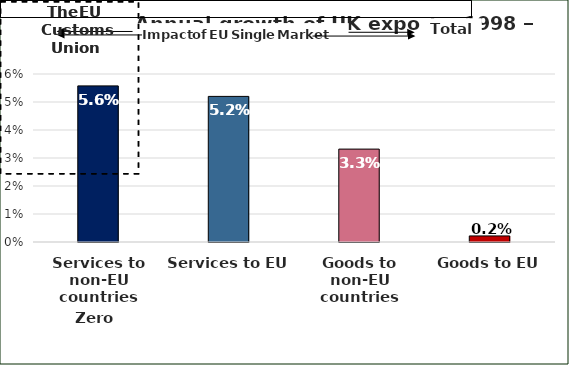
| Category | CAGR 1998/99 - 2017 |
|---|---|
| Services to non-EU countries | 0.056 |
| Services to EU  | 0.052 |
| Goods to non-EU countries | 0.033 |
| Goods to EU | 0.002 |